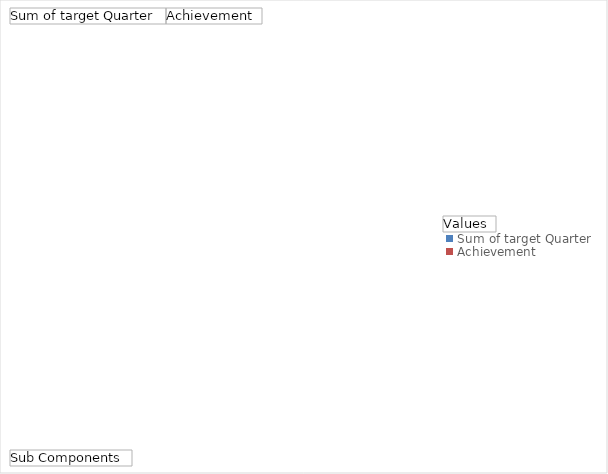
| Category | Sum of target Quarter | Achievement |
|---|---|---|
| WP/03
Kandalama Madurupitiya Rd 4.80km
Muruthana Bambukuliya Rd 3.40km
Adiambalama Kithulpitiya Rd 2.00km | 0.15 | 0 |
| NWP/03
Maho Nagollagama Rd 10.00km
Maspotha Thisnapola Rd 4.20km | 0.15 | 0.295 |
| NCP/03
Dambuluhalmillewa Galkiriyagama Rd 11.00km
Negama Halmillewa Rd 5.00km
Rathmale Nachchaduwa Rd 3.00km
Alisthna Thuruwila Rd 2.80km | 0.15 | 0.03 |
| UV/03
Ambagasdowa Dangamuwa Rd 4.44km
Nugathalawa Jayasooriya Rd 5.03km | 0.15 | 0.078 |
| EP/04
Hensman Rd 6.00km
Thumpankerney Thikkodai Rd 7.00km
Police Station Eruvil Rd 1.44km
Vavuvathivu Karaveddi Rd 2.00km | 0.15 | 0.02 |
| CP/03
Hettipola Town Rd 1.20km
Hattota Amuna Colony Rd 2.20km
Siyambalagaswewa (Nagolla -Welipitiya) Rd 4.00km
Sigiriya Pidurangala Awudawela Rd 4.00km | 0.15 | 0.025 |
| NP/03R
Pallamadhu Vidathalthivu Rd 1.77km
Thiruketheswaram Rd 1.34km
Puthukkuduyirippu Rd 1.80km
Coolyshed rd 0.80km
Erukkalampitty Amaipadukkai Rd 1.75km
Nanattan Periyapulaveli Potkerney Rd 2.74km
Nedunkandal Sornapuri Karukkakulam Rd 1.20km | 0.05 | 0.02 |
| SP/03R
Narawela Poddala Rd 3.90km
Ulukvitike Karapitiya Rd 0.56km
Ukwaththa Piyadigama Rd 2.56km | 0.05 | 0 |
| EP/03R
LB Chanel Rd 8.50km | 0.05 | 0 |
| UV/05R
Ella Halpe Rd 2.17km
Bindunuwewa Badulugasthenna Rd 2.43km
Dikulpotha Kirioruwa Rd 3.10km
Marangahawel Kosgama Rd 3.50km  | 0.05 | 0 |